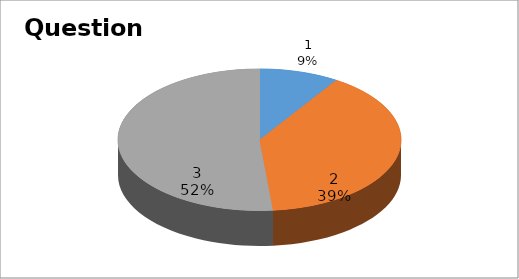
| Category | Series 0 |
|---|---|
| 0 | 3 |
| 1 | 13 |
| 2 | 17 |